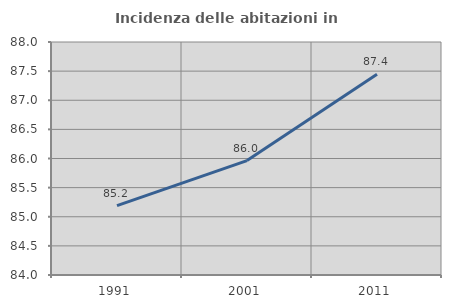
| Category | Incidenza delle abitazioni in proprietà  |
|---|---|
| 1991.0 | 85.192 |
| 2001.0 | 85.965 |
| 2011.0 | 87.446 |